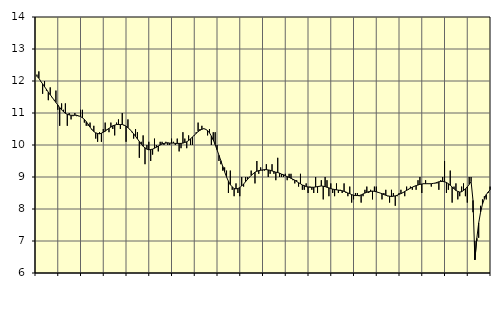
| Category | Tillverkning av verkstadsvaror, SNI 25-30, 33 | Series 1 |
|---|---|---|
| nan | 12.2 | 12.14 |
| 1.0 | 12.3 | 12.09 |
| 1.0 | 12 | 11.99 |
| 1.0 | 11.6 | 11.91 |
| 1.0 | 12 | 11.82 |
| 1.0 | 11.7 | 11.74 |
| 1.0 | 11.4 | 11.65 |
| 1.0 | 11.8 | 11.57 |
| 1.0 | 11.5 | 11.49 |
| 1.0 | 11.4 | 11.41 |
| 1.0 | 11.7 | 11.33 |
| 1.0 | 11.1 | 11.25 |
| nan | 10.6 | 11.17 |
| 2.0 | 11.3 | 11.1 |
| 2.0 | 11.1 | 11.04 |
| 2.0 | 11.3 | 10.99 |
| 2.0 | 10.6 | 10.96 |
| 2.0 | 11 | 10.94 |
| 2.0 | 10.8 | 10.93 |
| 2.0 | 10.9 | 10.93 |
| 2.0 | 11 | 10.93 |
| 2.0 | 10.9 | 10.93 |
| 2.0 | 10.9 | 10.91 |
| 2.0 | 11.1 | 10.89 |
| nan | 11.1 | 10.85 |
| 3.0 | 10.7 | 10.8 |
| 3.0 | 10.6 | 10.73 |
| 3.0 | 10.6 | 10.65 |
| 3.0 | 10.7 | 10.56 |
| 3.0 | 10.5 | 10.48 |
| 3.0 | 10.6 | 10.42 |
| 3.0 | 10.2 | 10.38 |
| 3.0 | 10.1 | 10.36 |
| 3.0 | 10.4 | 10.35 |
| 3.0 | 10.1 | 10.37 |
| 3.0 | 10.5 | 10.4 |
| nan | 10.7 | 10.43 |
| 4.0 | 10.5 | 10.48 |
| 4.0 | 10.4 | 10.52 |
| 4.0 | 10.7 | 10.56 |
| 4.0 | 10.5 | 10.6 |
| 4.0 | 10.3 | 10.62 |
| 4.0 | 10.7 | 10.64 |
| 4.0 | 10.8 | 10.64 |
| 4.0 | 10.5 | 10.64 |
| 4.0 | 11 | 10.64 |
| 4.0 | 10.6 | 10.62 |
| 4.0 | 10.1 | 10.59 |
| nan | 10.8 | 10.54 |
| 5.0 | 10.5 | 10.49 |
| 5.0 | 10.4 | 10.42 |
| 5.0 | 10.2 | 10.35 |
| 5.0 | 10.5 | 10.27 |
| 5.0 | 10.4 | 10.19 |
| 5.0 | 9.6 | 10.11 |
| 5.0 | 10.1 | 10.03 |
| 5.0 | 10.3 | 9.96 |
| 5.0 | 9.4 | 9.91 |
| 5.0 | 10 | 9.87 |
| 5.0 | 10.1 | 9.85 |
| nan | 9.5 | 9.86 |
| 6.0 | 9.7 | 9.87 |
| 6.0 | 10.2 | 9.9 |
| 6.0 | 10 | 9.93 |
| 6.0 | 9.8 | 9.97 |
| 6.0 | 10.1 | 10 |
| 6.0 | 10.1 | 10.03 |
| 6.0 | 10 | 10.05 |
| 6.0 | 10.1 | 10.06 |
| 6.0 | 10 | 10.07 |
| 6.0 | 10 | 10.06 |
| 6.0 | 10.2 | 10.06 |
| nan | 10.1 | 10.06 |
| 7.0 | 10 | 10.05 |
| 7.0 | 10.2 | 10.05 |
| 7.0 | 9.8 | 10.05 |
| 7.0 | 9.9 | 10.05 |
| 7.0 | 10.4 | 10.06 |
| 7.0 | 10.2 | 10.08 |
| 7.0 | 9.9 | 10.1 |
| 7.0 | 10.3 | 10.14 |
| 7.0 | 10 | 10.19 |
| 7.0 | 10 | 10.25 |
| 7.0 | 10.3 | 10.31 |
| nan | 10.4 | 10.36 |
| 8.0 | 10.7 | 10.42 |
| 8.0 | 10.5 | 10.46 |
| 8.0 | 10.6 | 10.49 |
| 8.0 | 10.5 | 10.51 |
| 8.0 | 10.5 | 10.49 |
| 8.0 | 10.3 | 10.45 |
| 8.0 | 10.5 | 10.38 |
| 8.0 | 10 | 10.28 |
| 8.0 | 10.4 | 10.16 |
| 8.0 | 10.4 | 10.01 |
| 8.0 | 10 | 9.85 |
| nan | 9.5 | 9.68 |
| 9.0 | 9.4 | 9.51 |
| 9.0 | 9.2 | 9.33 |
| 9.0 | 9.3 | 9.16 |
| 9.0 | 9.2 | 9 |
| 9.0 | 8.5 | 8.87 |
| 9.0 | 9.2 | 8.76 |
| 9.0 | 8.6 | 8.69 |
| 9.0 | 8.4 | 8.64 |
| 9.0 | 8.8 | 8.63 |
| 9.0 | 8.5 | 8.64 |
| 9.0 | 8.4 | 8.67 |
| nan | 9 | 8.72 |
| 10.0 | 8.7 | 8.78 |
| 10.0 | 9 | 8.85 |
| 10.0 | 9 | 8.92 |
| 10.0 | 9 | 8.99 |
| 10.0 | 9.2 | 9.05 |
| 10.0 | 9.1 | 9.1 |
| 10.0 | 8.8 | 9.15 |
| 10.0 | 9.5 | 9.18 |
| 10.0 | 9.1 | 9.2 |
| 10.0 | 9.3 | 9.21 |
| 10.0 | 9.2 | 9.22 |
| nan | 9.2 | 9.23 |
| 11.0 | 9.4 | 9.23 |
| 11.0 | 9 | 9.22 |
| 11.0 | 9.1 | 9.21 |
| 11.0 | 9.4 | 9.19 |
| 11.0 | 9.1 | 9.17 |
| 11.0 | 8.9 | 9.15 |
| 11.0 | 9.6 | 9.14 |
| 11.0 | 9 | 9.12 |
| 11.0 | 9 | 9.09 |
| 11.0 | 9 | 9.07 |
| 11.0 | 9.1 | 9.04 |
| nan | 8.9 | 9.01 |
| 12.0 | 9.1 | 8.99 |
| 12.0 | 9.1 | 8.96 |
| 12.0 | 8.9 | 8.93 |
| 12.0 | 8.8 | 8.9 |
| 12.0 | 8.9 | 8.86 |
| 12.0 | 8.7 | 8.82 |
| 12.0 | 9.1 | 8.79 |
| 12.0 | 8.6 | 8.75 |
| 12.0 | 8.6 | 8.73 |
| 12.0 | 8.8 | 8.7 |
| 12.0 | 8.5 | 8.69 |
| nan | 8.7 | 8.68 |
| 13.0 | 8.6 | 8.68 |
| 13.0 | 8.5 | 8.68 |
| 13.0 | 9 | 8.69 |
| 13.0 | 8.5 | 8.7 |
| 13.0 | 8.7 | 8.71 |
| 13.0 | 8.9 | 8.72 |
| 13.0 | 8.3 | 8.71 |
| 13.0 | 9 | 8.7 |
| 13.0 | 8.9 | 8.68 |
| 13.0 | 8.4 | 8.66 |
| 13.0 | 8.8 | 8.64 |
| nan | 8.5 | 8.62 |
| 14.0 | 8.4 | 8.61 |
| 14.0 | 8.8 | 8.6 |
| 14.0 | 8.5 | 8.59 |
| 14.0 | 8.6 | 8.58 |
| 14.0 | 8.5 | 8.57 |
| 14.0 | 8.8 | 8.55 |
| 14.0 | 8.5 | 8.53 |
| 14.0 | 8.4 | 8.5 |
| 14.0 | 8.7 | 8.48 |
| 14.0 | 8.2 | 8.45 |
| 14.0 | 8.3 | 8.43 |
| nan | 8.5 | 8.42 |
| 15.0 | 8.5 | 8.42 |
| 15.0 | 8.4 | 8.42 |
| 15.0 | 8.2 | 8.44 |
| 15.0 | 8.4 | 8.47 |
| 15.0 | 8.6 | 8.5 |
| 15.0 | 8.7 | 8.52 |
| 15.0 | 8.5 | 8.54 |
| 15.0 | 8.6 | 8.55 |
| 15.0 | 8.3 | 8.56 |
| 15.0 | 8.7 | 8.55 |
| 15.0 | 8.7 | 8.54 |
| nan | 8.5 | 8.52 |
| 16.0 | 8.5 | 8.5 |
| 16.0 | 8.3 | 8.48 |
| 16.0 | 8.5 | 8.45 |
| 16.0 | 8.6 | 8.43 |
| 16.0 | 8.4 | 8.41 |
| 16.0 | 8.2 | 8.4 |
| 16.0 | 8.6 | 8.39 |
| 16.0 | 8.5 | 8.4 |
| 16.0 | 8.1 | 8.41 |
| 16.0 | 8.4 | 8.43 |
| 16.0 | 8.5 | 8.46 |
| nan | 8.6 | 8.48 |
| 17.0 | 8.5 | 8.51 |
| 17.0 | 8.4 | 8.55 |
| 17.0 | 8.7 | 8.58 |
| 17.0 | 8.6 | 8.62 |
| 17.0 | 8.7 | 8.65 |
| 17.0 | 8.6 | 8.68 |
| 17.0 | 8.7 | 8.71 |
| 17.0 | 8.6 | 8.73 |
| 17.0 | 8.9 | 8.75 |
| 17.0 | 9 | 8.77 |
| 17.0 | 8.5 | 8.78 |
| nan | 8.8 | 8.79 |
| 18.0 | 8.9 | 8.79 |
| 18.0 | 8.8 | 8.79 |
| 18.0 | 8.8 | 8.79 |
| 18.0 | 8.7 | 8.79 |
| 18.0 | 8.8 | 8.8 |
| 18.0 | 8.8 | 8.81 |
| 18.0 | 8.8 | 8.83 |
| 18.0 | 8.6 | 8.85 |
| 18.0 | 8.9 | 8.86 |
| 18.0 | 9 | 8.86 |
| 18.0 | 9.5 | 8.85 |
| nan | 8.5 | 8.83 |
| 19.0 | 8.6 | 8.79 |
| 19.0 | 9.2 | 8.74 |
| 19.0 | 8.2 | 8.69 |
| 19.0 | 8.7 | 8.63 |
| 19.0 | 8.8 | 8.58 |
| 19.0 | 8.3 | 8.55 |
| 19.0 | 8.4 | 8.53 |
| 19.0 | 8.7 | 8.54 |
| 19.0 | 8.8 | 8.58 |
| 19.0 | 8.4 | 8.63 |
| 19.0 | 8.2 | 8.69 |
| nan | 9 | 8.77 |
| 20.0 | 9 | 8.86 |
| 20.0 | 7.9 | 8.27 |
| 20.0 | 7 | 6.41 |
| 20.0 | 7 | 7.08 |
| 20.0 | 7.1 | 7.56 |
| 20.0 | 8.1 | 7.9 |
| 20.0 | 8.3 | 8.15 |
| 20.0 | 8.4 | 8.32 |
| 20.0 | 8.3 | 8.45 |
| 20.0 | 8.5 | 8.53 |
| 20.0 | 8.7 | 8.6 |